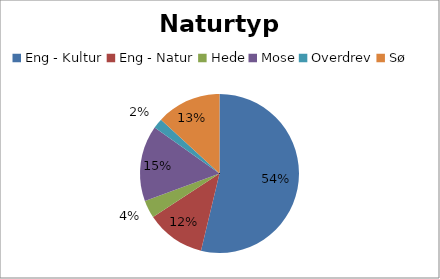
| Category | Series 0 |
|---|---|
| Eng - Kultur | 237 |
| Eng - Natur | 53 |
| Hede | 16 |
| Mose | 68 |
| Overdrev | 9 |
| Sø | 58 |